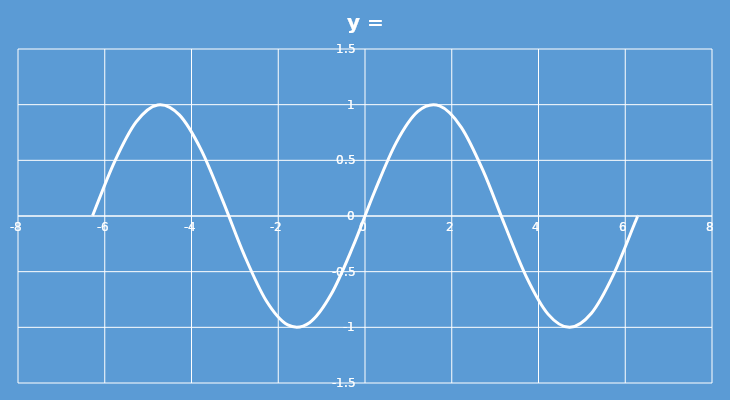
| Category | Series 0 |
|---|---|
| -6.28 | 0.003 |
| -5.78 | 0.482 |
| -5.28 | 0.843 |
| -4.78 | 0.998 |
| -4.28 | 0.908 |
| -3.7800000000000002 | 0.596 |
| -3.2800000000000002 | 0.138 |
| -2.7800000000000002 | -0.354 |
| -2.2800000000000002 | -0.759 |
| -1.7800000000000002 | -0.978 |
| -1.2800000000000002 | -0.958 |
| -0.7800000000000002 | -0.703 |
| -0.28000000000000025 | -0.276 |
| 0.21999999999999975 | 0.218 |
| 0.7199999999999998 | 0.659 |
| 1.2199999999999998 | 0.939 |
| 1.7199999999999998 | 0.989 |
| 2.2199999999999998 | 0.797 |
| 2.7199999999999998 | 0.409 |
| 3.2199999999999998 | -0.078 |
| 3.7199999999999998 | -0.547 |
| 4.22 | -0.881 |
| 4.72 | -1 |
| 5.22 | -0.874 |
| 5.72 | -0.534 |
| 6.22 | -0.063 |
| 6.28 | -0.003 |